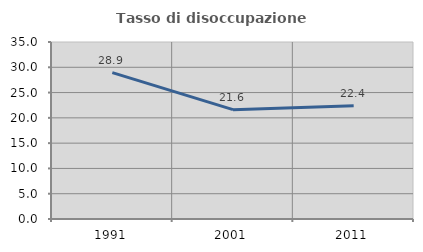
| Category | Tasso di disoccupazione giovanile  |
|---|---|
| 1991.0 | 28.947 |
| 2001.0 | 21.622 |
| 2011.0 | 22.414 |